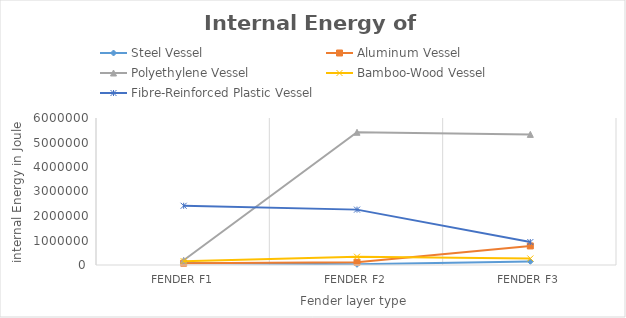
| Category | Steel Vessel | Aluminum Vessel | Polyethylene Vessel | Bamboo-Wood Vessel | Fibre-Reinforced Plastic Vessel |
|---|---|---|---|---|---|
| Fender F1 | 84810 | 74022 | 194060 | 158050 | 2417200 |
| Fender F2 | 28427 | 110000 | 5417300 | 338080 | 2260200 |
| Fender F3 | 147850 | 778110 | 5331500 | 265460 | 936450 |